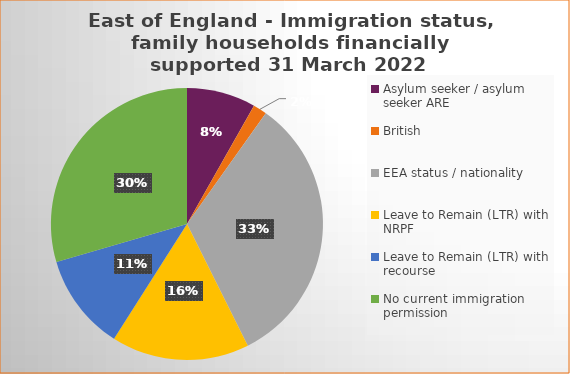
| Category | Number  | Percentage |
|---|---|---|
| Asylum seeker / asylum seeker ARE | 5 | 0.082 |
| British | 1 | 0.016 |
| EEA status / nationality  | 20 | 0.328 |
| Leave to Remain (LTR) with NRPF | 10 | 0.164 |
| Leave to Remain (LTR) with recourse | 7 | 0.115 |
| No current immigration permission | 18 | 0.295 |